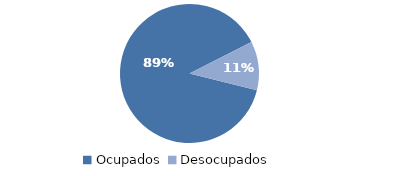
| Category | Series 0 |
|---|---|
| Ocupados | 4075.011 |
| Desocupados | 524.058 |